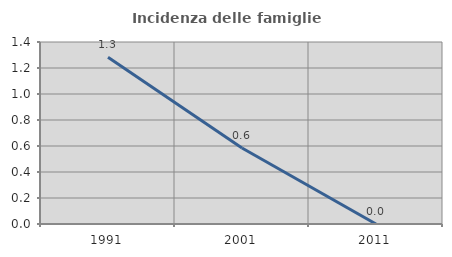
| Category | Incidenza delle famiglie numerose |
|---|---|
| 1991.0 | 1.282 |
| 2001.0 | 0.585 |
| 2011.0 | 0 |